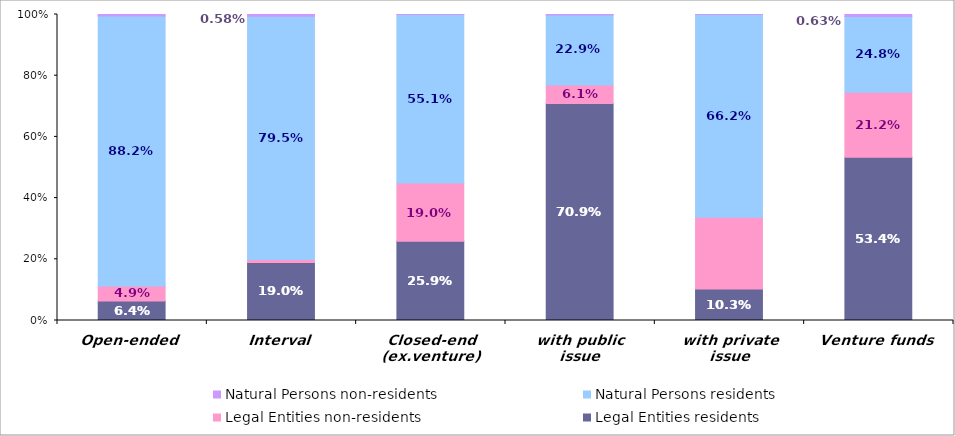
| Category | Legal Entities | Natural Persons |
|---|---|---|
| Open-ended | 0.049 | 0.005 |
| Interval | 0.009 | 0.006 |
| Closed-end (ex.venture) | 0.19 | 0 |
| with public issue | 0.061 | 0.001 |
| with private issue | 0.235 | 0 |
| Venture funds | 0.212 | 0.006 |